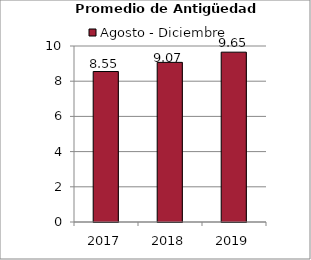
| Category | Agosto - Diciembre |
|---|---|
| 2017.0 | 8.55 |
| 2018.0 | 9.07 |
| 2019.0 | 9.65 |